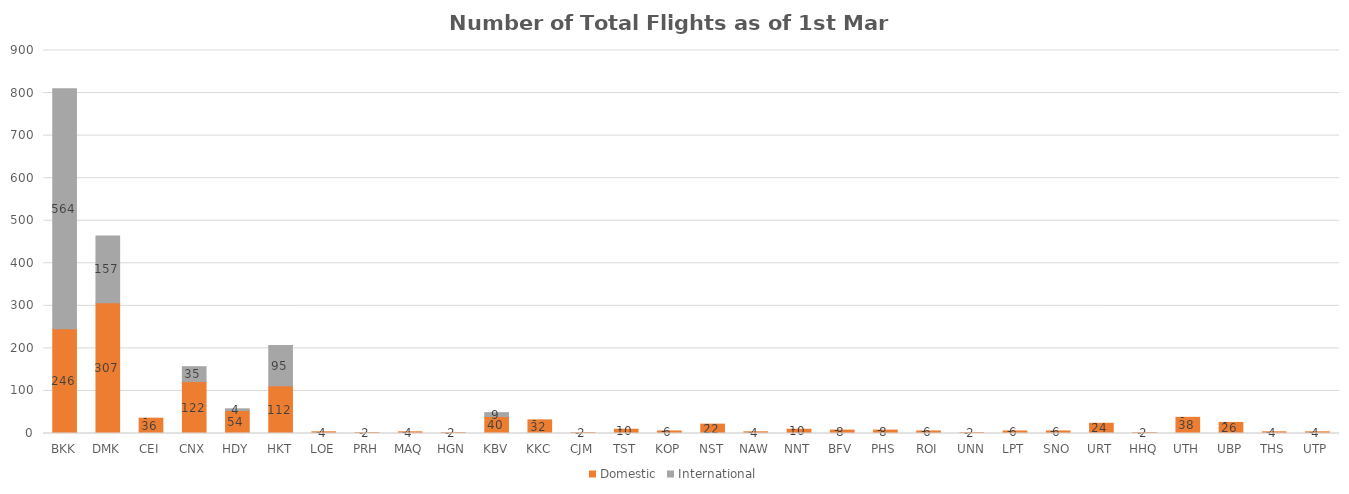
| Category | Domestic | International |
|---|---|---|
| BKK | 246 | 564 |
| DMK | 307 | 157 |
| CEI | 36 | 0 |
| CNX | 122 | 35 |
| HDY | 54 | 4 |
| HKT | 112 | 95 |
| LOE | 4 | 0 |
| PRH | 2 | 0 |
| MAQ | 4 | 0 |
| HGN | 2 | 0 |
| KBV | 40 | 9 |
| KKC | 32 | 0 |
| CJM | 2 | 0 |
| TST | 10 | 0 |
| KOP | 6 | 0 |
| NST | 22 | 0 |
| NAW | 4 | 0 |
| NNT | 10 | 0 |
| BFV | 8 | 0 |
| PHS | 8 | 0 |
| ROI | 6 | 0 |
| UNN | 2 | 0 |
| LPT | 6 | 0 |
| SNO | 6 | 0 |
| URT | 24 | 0 |
| HHQ | 2 | 0 |
| UTH | 38 | 0 |
| UBP | 26 | 0 |
| THS | 4 | 0 |
| UTP | 4 | 0 |